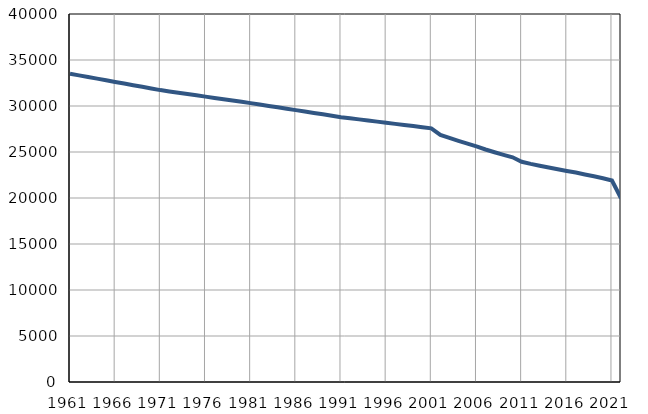
| Category | Population
size |
|---|---|
| 1961.0 | 33507 |
| 1962.0 | 33329 |
| 1963.0 | 33151 |
| 1964.0 | 32974 |
| 1965.0 | 32796 |
| 1966.0 | 32618 |
| 1967.0 | 32440 |
| 1968.0 | 32262 |
| 1969.0 | 32085 |
| 1970.0 | 31907 |
| 1971.0 | 31729 |
| 1972.0 | 31587 |
| 1973.0 | 31446 |
| 1974.0 | 31304 |
| 1975.0 | 31162 |
| 1976.0 | 31020 |
| 1977.0 | 30879 |
| 1978.0 | 30737 |
| 1979.0 | 30595 |
| 1980.0 | 30454 |
| 1981.0 | 30312 |
| 1982.0 | 30160 |
| 1983.0 | 30007 |
| 1984.0 | 29855 |
| 1985.0 | 29702 |
| 1986.0 | 29550 |
| 1987.0 | 29398 |
| 1988.0 | 29245 |
| 1989.0 | 29093 |
| 1990.0 | 28940 |
| 1991.0 | 28788 |
| 1992.0 | 28666 |
| 1993.0 | 28545 |
| 1994.0 | 28423 |
| 1995.0 | 28301 |
| 1996.0 | 28180 |
| 1997.0 | 28058 |
| 1998.0 | 27937 |
| 1999.0 | 27815 |
| 2000.0 | 27693 |
| 2001.0 | 27572 |
| 2002.0 | 26855 |
| 2003.0 | 26524 |
| 2004.0 | 26211 |
| 2005.0 | 25918 |
| 2006.0 | 25601 |
| 2007.0 | 25271 |
| 2008.0 | 24970 |
| 2009.0 | 24690 |
| 2010.0 | 24422 |
| 2011.0 | 23940 |
| 2012.0 | 23712 |
| 2013.0 | 23512 |
| 2014.0 | 23320 |
| 2015.0 | 23116 |
| 2016.0 | 22932 |
| 2017.0 | 22762 |
| 2018.0 | 22563 |
| 2019.0 | 22359 |
| 2020.0 | 22139 |
| 2021.0 | 21896 |
| 2022.0 | 19976 |